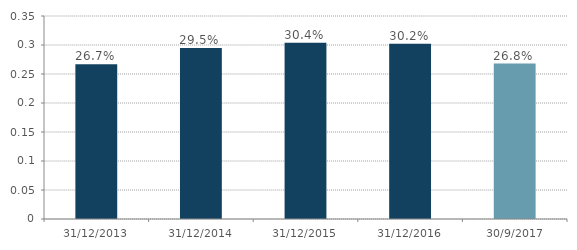
| Category | Series 0 |
|---|---|
| 2013-12-31 | 0.267 |
| 2014-12-31 | 0.295 |
| 2015-12-31 | 0.304 |
| 2016-12-31 | 0.302 |
| 2017-09-30 | 0.268 |